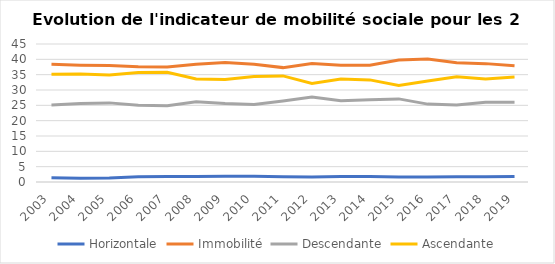
| Category | Horizontale | Immobilité | Descendante | Ascendante |
|---|---|---|---|---|
| 2003.0 | 1.4 | 38.4 | 25.1 | 35.1 |
| 2004.0 | 1.2 | 38.1 | 25.6 | 35.2 |
| 2005.0 | 1.3 | 38 | 25.8 | 34.9 |
| 2006.0 | 1.7 | 37.6 | 25 | 35.7 |
| 2007.0 | 1.8 | 37.5 | 24.9 | 35.8 |
| 2008.0 | 1.8 | 38.4 | 26.2 | 33.6 |
| 2009.0 | 1.9 | 39 | 25.6 | 33.4 |
| 2010.0 | 1.9 | 38.4 | 25.3 | 34.4 |
| 2011.0 | 1.7 | 37.3 | 26.4 | 34.6 |
| 2012.0 | 1.6 | 38.6 | 27.7 | 32.1 |
| 2013.0 | 1.8 | 38.1 | 26.5 | 33.6 |
| 2014.0 | 1.8 | 38.1 | 26.8 | 33.3 |
| 2015.0 | 1.6 | 39.8 | 27.1 | 31.5 |
| 2016.0 | 1.6 | 40.1 | 25.4 | 32.9 |
| 2017.0 | 1.7 | 38.9 | 25.1 | 34.3 |
| 2018.0 | 1.7 | 38.6 | 26 | 33.6 |
| 2019.0 | 1.8 | 37.9 | 26 | 34.2 |